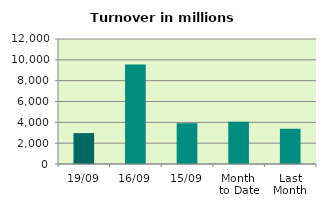
| Category | Series 0 |
|---|---|
| 19/09 | 2967.124 |
| 16/09 | 9541.865 |
| 15/09 | 3919.519 |
| Month 
to Date | 4064.662 |
| Last
Month | 3384.596 |